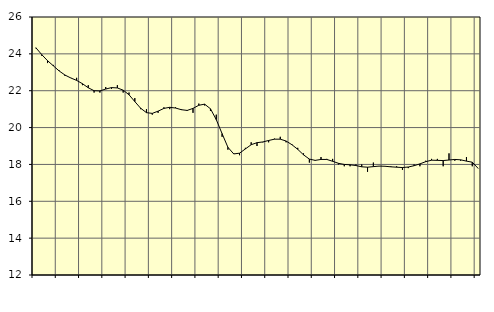
| Category | Piggar | Tillverkning o utvinning, energi o miljö, SNI 05-33, 35-39 |
|---|---|---|
| nan | 24.3 | 24.33 |
| 1.0 | 23.9 | 23.96 |
| 1.0 | 23.5 | 23.63 |
| 1.0 | 23.4 | 23.35 |
| nan | 23.1 | 23.07 |
| 2.0 | 22.8 | 22.85 |
| 2.0 | 22.7 | 22.69 |
| 2.0 | 22.7 | 22.56 |
| nan | 22.3 | 22.38 |
| 3.0 | 22.3 | 22.16 |
| 3.0 | 21.9 | 22 |
| 3.0 | 21.9 | 21.99 |
| nan | 22.2 | 22.09 |
| 4.0 | 22.1 | 22.17 |
| 4.0 | 22.3 | 22.15 |
| 4.0 | 21.9 | 22.03 |
| nan | 21.9 | 21.78 |
| 5.0 | 21.6 | 21.41 |
| 5.0 | 21 | 21.05 |
| 5.0 | 21 | 20.81 |
| nan | 20.7 | 20.77 |
| 6.0 | 20.8 | 20.89 |
| 6.0 | 21.1 | 21.04 |
| 6.0 | 21 | 21.1 |
| nan | 21.1 | 21.06 |
| 7.0 | 21 | 20.97 |
| 7.0 | 20.9 | 20.93 |
| 7.0 | 20.8 | 21.04 |
| nan | 21.3 | 21.21 |
| 8.0 | 21.2 | 21.27 |
| 8.0 | 20.9 | 21.02 |
| 8.0 | 20.7 | 20.43 |
| nan | 19.5 | 19.67 |
| 9.0 | 18.8 | 18.93 |
| 9.0 | 18.6 | 18.57 |
| 9.0 | 18.5 | 18.61 |
| nan | 18.9 | 18.84 |
| 10.0 | 19.2 | 19.07 |
| 10.0 | 19 | 19.18 |
| 10.0 | 19.2 | 19.22 |
| nan | 19.2 | 19.3 |
| 11.0 | 19.4 | 19.37 |
| 11.0 | 19.5 | 19.37 |
| 11.0 | 19.2 | 19.27 |
| nan | 19.1 | 19.07 |
| 12.0 | 18.9 | 18.82 |
| 12.0 | 18.6 | 18.52 |
| 12.0 | 18.1 | 18.29 |
| nan | 18.2 | 18.22 |
| 13.0 | 18.4 | 18.27 |
| 13.0 | 18.3 | 18.27 |
| 13.0 | 18.3 | 18.17 |
| nan | 18 | 18.06 |
| 14.0 | 17.9 | 18 |
| 14.0 | 17.9 | 17.98 |
| 14.0 | 18 | 17.94 |
| nan | 18 | 17.87 |
| 15.0 | 17.6 | 17.85 |
| 15.0 | 18.1 | 17.88 |
| 15.0 | 17.9 | 17.91 |
| nan | 17.9 | 17.9 |
| 16.0 | 17.9 | 17.87 |
| 16.0 | 17.9 | 17.85 |
| 16.0 | 17.7 | 17.83 |
| nan | 17.8 | 17.86 |
| 17.0 | 18 | 17.93 |
| 17.0 | 17.9 | 18.03 |
| 17.0 | 18.2 | 18.15 |
| nan | 18.3 | 18.23 |
| 18.0 | 18.3 | 18.22 |
| 18.0 | 17.9 | 18.21 |
| 18.0 | 18.6 | 18.24 |
| nan | 18.2 | 18.27 |
| 19.0 | 18.2 | 18.25 |
| 19.0 | 18.4 | 18.18 |
| 19.0 | 17.9 | 18.12 |
| nan | 17.8 | 17.79 |